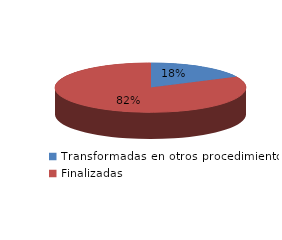
| Category | Series 0 |
|---|---|
| Transformadas en otros procedimientos | 33056 |
| Finalizadas | 153678 |